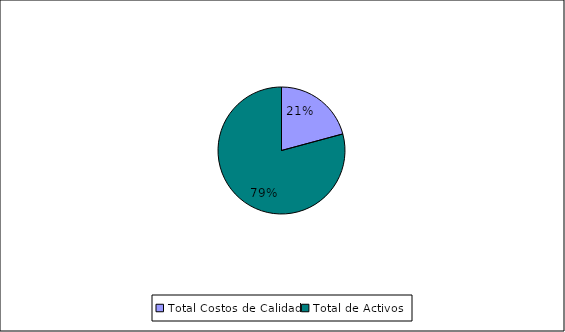
| Category | Series 0 |
|---|---|
| Total Costos de Calidad | 1050529 |
| Total de Activos | 4000000 |